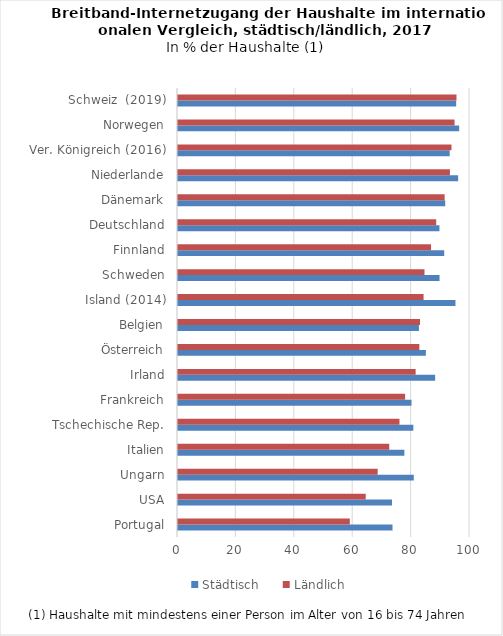
| Category | Städtisch | Ländlich |
|---|---|---|
| Portugal | 73.46 | 58.842 |
| USA | 73.29 | 64.29 |
| Ungarn | 80.754 | 68.384 |
| Italien | 77.526 | 72.338 |
| Tschechische Rep. | 80.601 | 75.845 |
| Frankreich | 79.962 | 77.774 |
| Irland | 88.058 | 81.386 |
| Österreich | 84.888 | 82.654 |
| Belgien | 82.504 | 82.886 |
| Island (2014) | 95.02 | 84.096 |
| Schweden | 89.57 | 84.42 |
| Finnland | 91.166 | 86.661 |
| Deutschland | 89.534 | 88.423 |
| Dänemark | 91.511 | 91.312 |
| Niederlande | 95.934 | 93.13 |
| Ver. Königreich (2016) | 93.037 | 93.662 |
| Norwegen | 96.29 | 94.706 |
| Schweiz  (2019) | 95.269 | 95.371 |